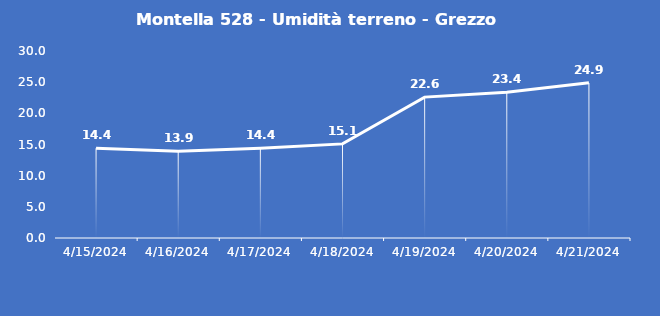
| Category | Montella 528 - Umidità terreno - Grezzo (%VWC) |
|---|---|
| 4/15/24 | 14.4 |
| 4/16/24 | 13.9 |
| 4/17/24 | 14.4 |
| 4/18/24 | 15.1 |
| 4/19/24 | 22.6 |
| 4/20/24 | 23.4 |
| 4/21/24 | 24.9 |